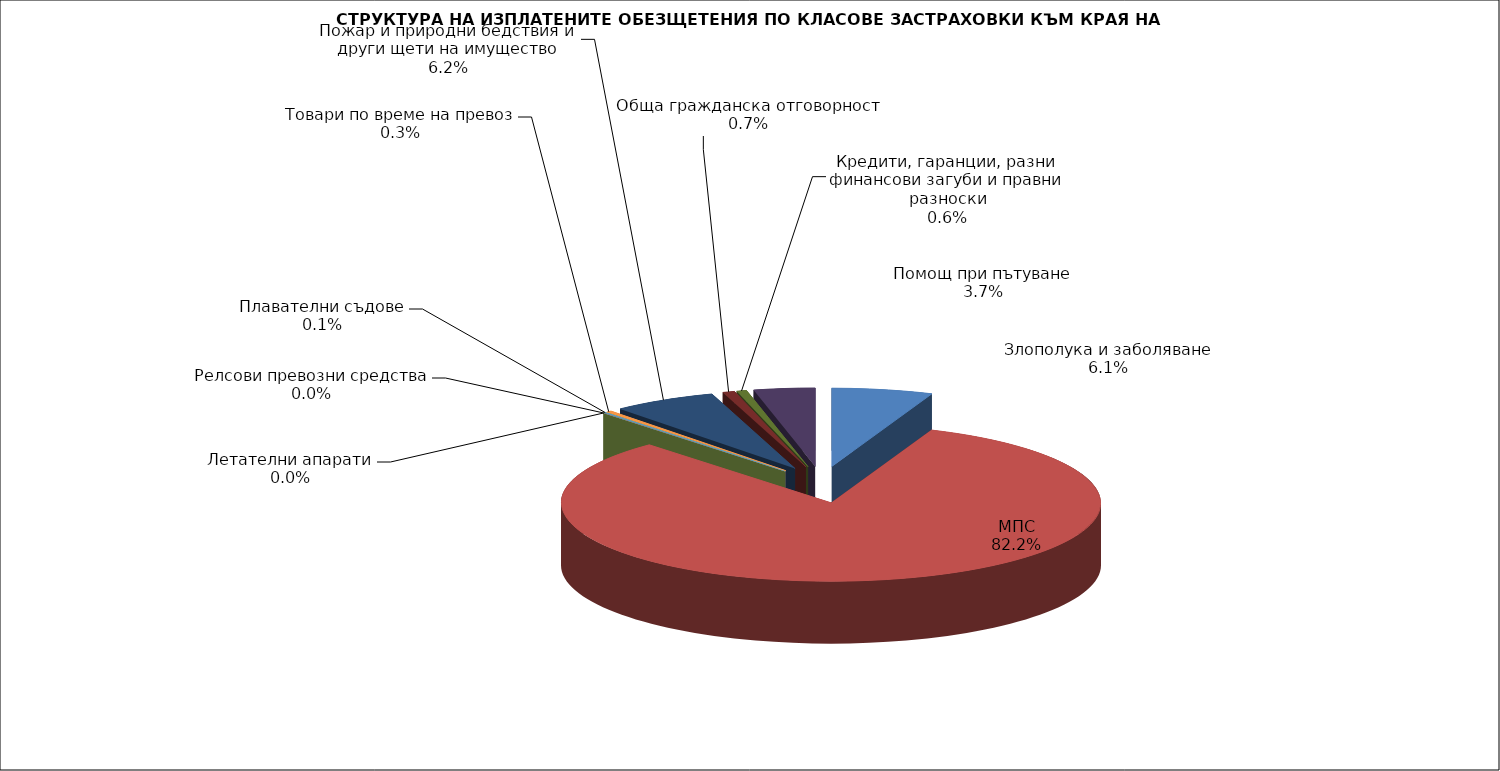
| Category | Злополука и заболяване |
|---|---|
| Злополука и заболяване | 0.061 |
| МПС | 0.822 |
| Релсови превозни средства | 0 |
| Летателни апарати | 0 |
| Плавателни съдове | 0.001 |
| Товари по време на превоз | 0.003 |
| Пожар и природни бедствия и други щети на имущество | 0.062 |
| Обща гражданска отговорност | 0.007 |
| Кредити, гаранции, разни финансови загуби и правни разноски | 0.006 |
| Помощ при пътуване | 0.037 |